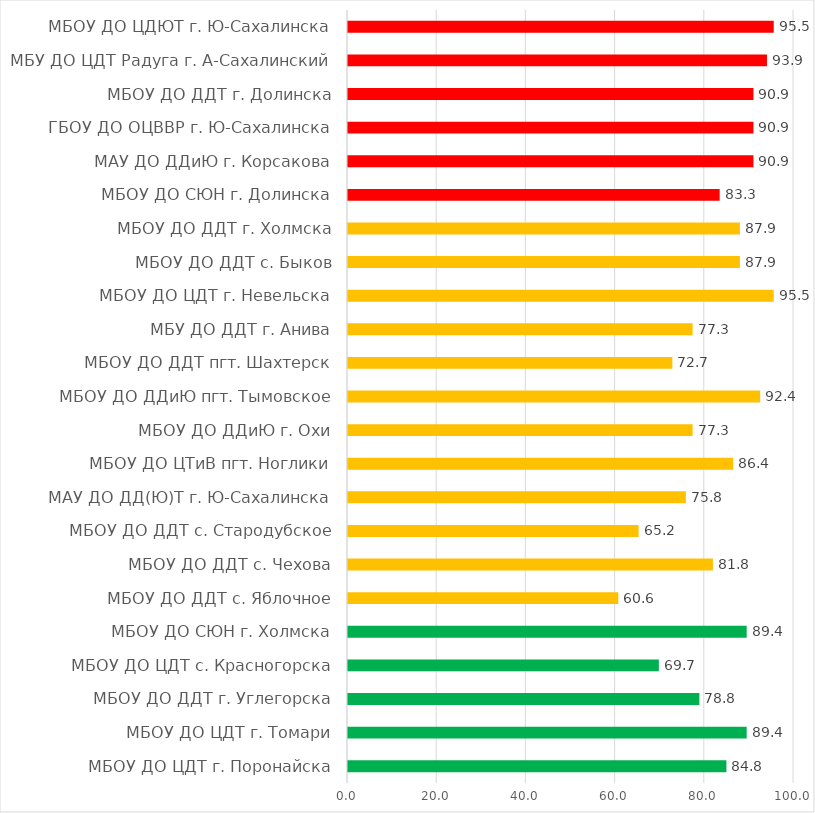
| Category | Series 0 |
|---|---|
| МБОУ ДО ЦДТ г. Поронайска | 84.848 |
| МБОУ ДО ЦДТ г. Томари | 89.394 |
| МБОУ ДО ДДТ г. Углегорска | 78.788 |
| МБОУ ДО ЦДТ с. Красногорска | 69.697 |
| МБОУ ДО СЮН г. Холмска | 89.394 |
| МБОУ ДО ДДТ с. Яблочное | 60.606 |
| МБОУ ДО ДДТ с. Чехова | 81.818 |
| МБОУ ДО ДДТ с. Стародубское | 65.152 |
| МАУ ДО ДД(Ю)Т г. Ю-Сахалинска | 75.758 |
| МБОУ ДО ЦТиВ пгт. Ноглики | 86.364 |
| МБОУ ДО ДДиЮ г. Охи | 77.273 |
| МБОУ ДО ДДиЮ пгт. Тымовское | 92.424 |
| МБОУ ДО ДДТ пгт. Шахтерск | 72.727 |
| МБУ ДО ДДТ г. Анива | 77.273 |
| МБОУ ДО ЦДТ г. Невельска | 95.455 |
| МБОУ ДО ДДТ с. Быков | 87.879 |
| МБОУ ДО ДДТ г. Холмска | 87.879 |
| МБОУ ДО СЮН г. Долинска | 83.333 |
| МАУ ДО ДДиЮ г. Корсакова | 90.909 |
| ГБОУ ДО ОЦВВР г. Ю-Сахалинска | 90.909 |
| МБОУ ДО ДДТ г. Долинска | 90.909 |
| МБУ ДО ЦДТ Радуга г. А-Сахалинский | 93.939 |
| МБОУ ДО ЦДЮТ г. Ю-Сахалинска | 95.455 |